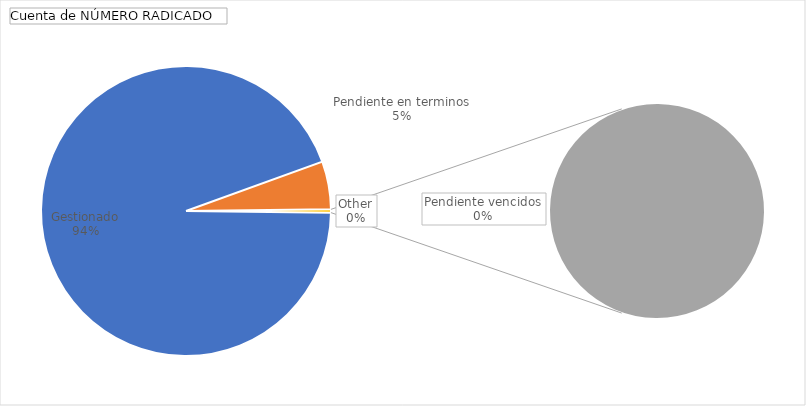
| Category | Total |
|---|---|
| Gestionado | 264 |
| Pendiente en terminos | 15 |
| Pendiente vencidos | 1 |